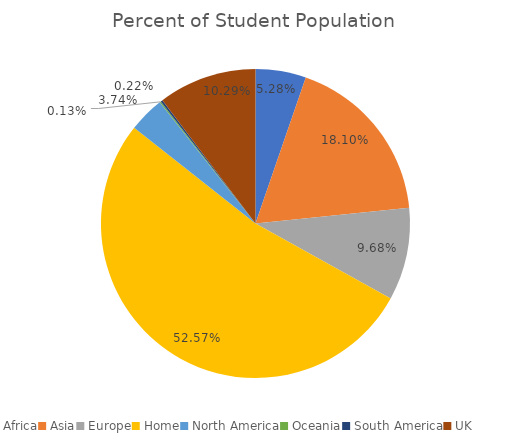
| Category | Percent of Student Population |
|---|---|
| Africa | 0.053 |
| Asia | 0.181 |
| Europe | 0.097 |
| Home | 0.526 |
| North America | 0.037 |
| Oceania | 0.001 |
| South America | 0.002 |
| UK | 0.103 |